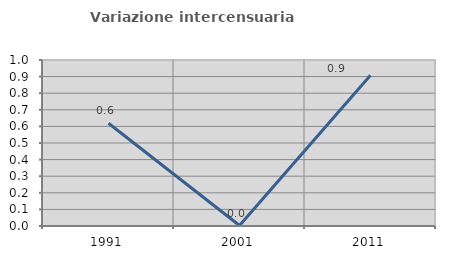
| Category | Variazione intercensuaria annua |
|---|---|
| 1991.0 | 0.619 |
| 2001.0 | 0.003 |
| 2011.0 | 0.908 |